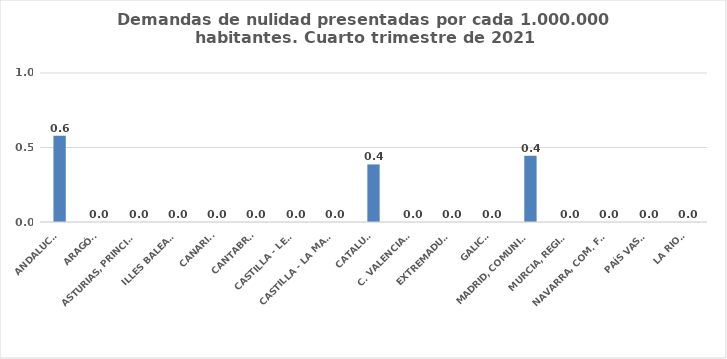
| Category | Series 0 |
|---|---|
| ANDALUCÍA | 0.579 |
| ARAGÓN | 0 |
| ASTURIAS, PRINCIPADO | 0 |
| ILLES BALEARS | 0 |
| CANARIAS | 0 |
| CANTABRIA | 0 |
| CASTILLA - LEÓN | 0 |
| CASTILLA - LA MANCHA | 0 |
| CATALUÑA | 0.386 |
| C. VALENCIANA | 0 |
| EXTREMADURA | 0 |
| GALICIA | 0 |
| MADRID, COMUNIDAD | 0.444 |
| MURCIA, REGIÓN | 0 |
| NAVARRA, COM. FORAL | 0 |
| PAÍS VASCO | 0 |
| LA RIOJA | 0 |